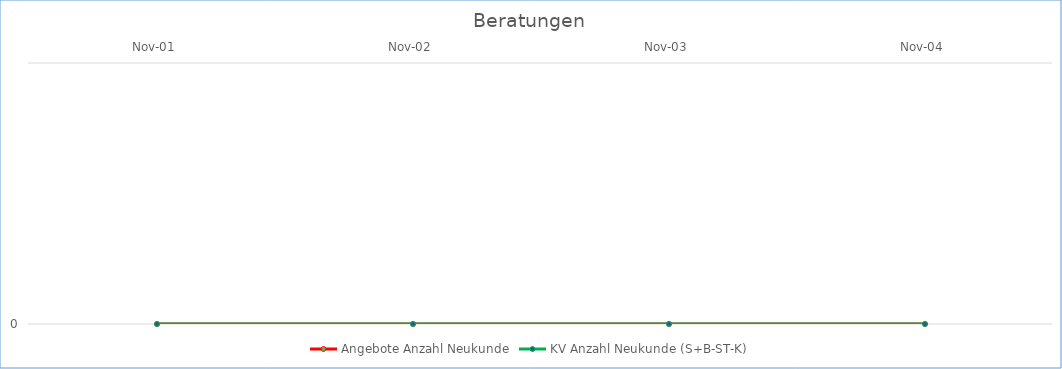
| Category | Angebote Anzahl Neukunde | KV Anzahl Neukunde (S+B-ST-K) |
|---|---|---|
| 2001-11-01 | 0 | 0 |
| 2002-11-01 | 0 | 0 |
| 2003-11-01 | 0 | 0 |
| 2004-11-01 | 0 | 0 |